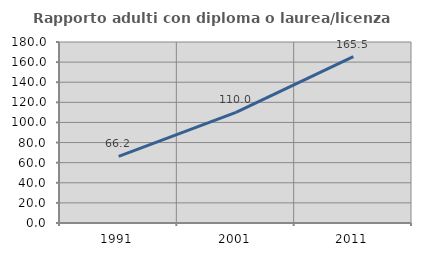
| Category | Rapporto adulti con diploma o laurea/licenza media  |
|---|---|
| 1991.0 | 66.197 |
| 2001.0 | 110.029 |
| 2011.0 | 165.55 |